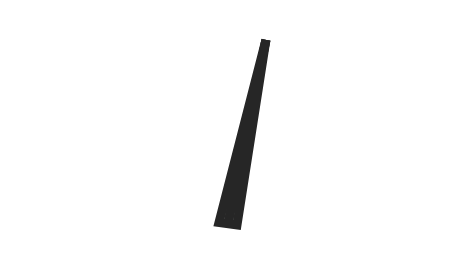
| Category | y |
|---|---|
| 58.322514301154385 | 49.302 |
| 51.97209969553553 | -0.333 |
| 48.02790030446447 | 0.333 |
| 58.322514301154385 | 49.302 |
| 50.0 | 0 |